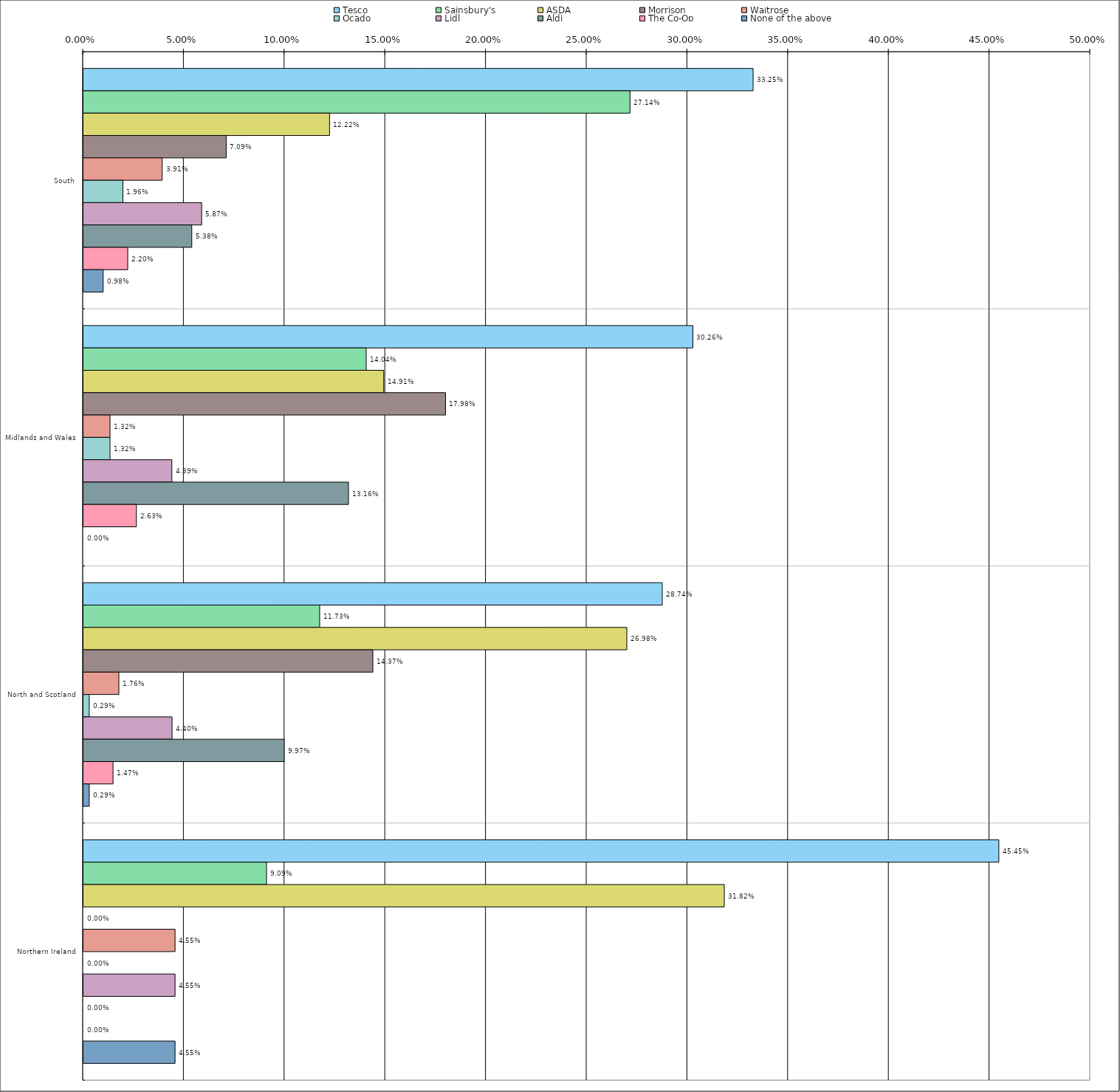
| Category | Tesco | Sainsbury's | ASDA | Morrison | Waitrose | Ocado | Lidl | Aldi | The Co-Op | None of the above |
|---|---|---|---|---|---|---|---|---|---|---|
| 0 | 0.332 | 0.271 | 0.122 | 0.071 | 0.039 | 0.02 | 0.059 | 0.054 | 0.022 | 0.01 |
| 1 | 0.303 | 0.14 | 0.149 | 0.18 | 0.013 | 0.013 | 0.044 | 0.132 | 0.026 | 0 |
| 2 | 0.287 | 0.117 | 0.27 | 0.144 | 0.018 | 0.003 | 0.044 | 0.1 | 0.015 | 0.003 |
| 3 | 0.454 | 0.091 | 0.318 | 0 | 0.046 | 0 | 0.046 | 0 | 0 | 0.046 |